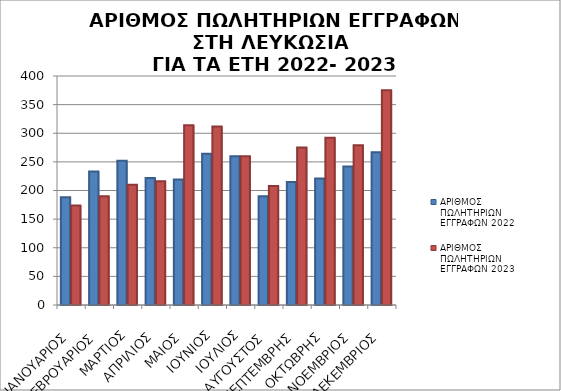
| Category | ΑΡΙΘΜΟΣ ΠΩΛΗΤΗΡΙΩΝ ΕΓΓΡΑΦΩΝ 2022 | ΑΡΙΘΜΟΣ ΠΩΛΗΤΗΡΙΩΝ ΕΓΓΡΑΦΩΝ 2023 |
|---|---|---|
| ΙΑΝΟΥΑΡΙΟΣ | 188 | 174 |
| ΦΕΒΡΟΥΑΡΙΟΣ | 233 | 190 |
| ΜΑΡΤΙΟΣ | 252 | 210 |
| ΑΠΡΙΛΙΟΣ | 222 | 216 |
| ΜΑΙΟΣ | 219 | 314 |
| ΙΟΥΝΙΟΣ | 264 | 312 |
| ΙΟΥΛΙΟΣ | 260 | 260 |
| ΑΥΓΟΥΣΤΟΣ | 190 | 208 |
| ΣΕΠΤΕΜΒΡΗΣ | 215 | 275 |
| ΟΚΤΩΒΡΗΣ | 221 | 292 |
| ΝΟΕΜΒΡΙΟΣ | 242 | 279 |
| ΔΕΚΕΜΒΡΙΟΣ | 267 | 375 |